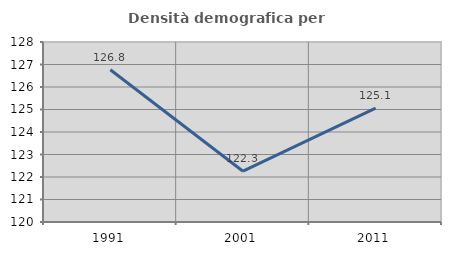
| Category | Densità demografica |
|---|---|
| 1991.0 | 126.769 |
| 2001.0 | 122.258 |
| 2011.0 | 125.061 |